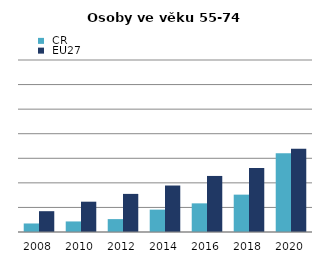
| Category |  ČR |  EU27 |
|---|---|---|
| 2008.0 | 3.47 | 8.468 |
| 2010.0 | 4.298 | 12.333 |
| 2012.0 | 5.247 | 15.509 |
| 2014.0 | 9.106 | 18.916 |
| 2016.0 | 11.661 | 22.813 |
| 2018.0 | 15.205 | 26.037 |
| 2020.0 | 32.1 | 33.91 |